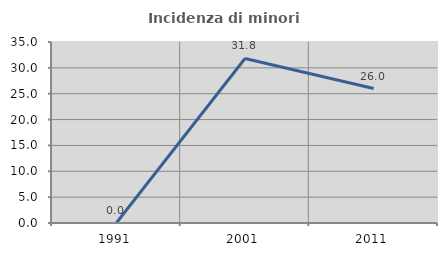
| Category | Incidenza di minori stranieri |
|---|---|
| 1991.0 | 0 |
| 2001.0 | 31.818 |
| 2011.0 | 26 |